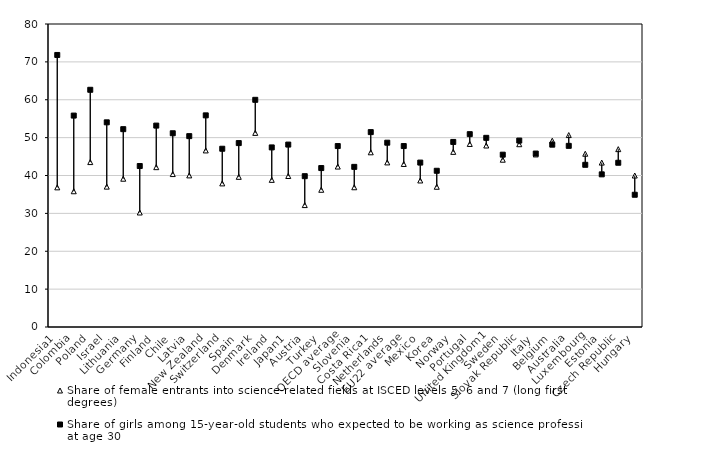
| Category | Share of female entrants into science-related fields at ISCED levels 5, 6 and 7 (long first degrees) | Share of girls among 15-year-old students who expected to be working as science professionals at age 30 |
|---|---|---|
| Indonesia1 | 36.871 | 71.824 |
| Colombia | 35.838 | 55.819 |
| Poland | 43.543 | 62.632 |
| Israel | 37.062 | 54.038 |
| Lithuania | 39.146 | 52.234 |
| Germany | 30.234 | 42.501 |
| Finland | 42.201 | 53.173 |
| Chile | 40.375 | 51.154 |
| Latvia | 40.027 | 50.394 |
| New Zealand | 46.619 | 55.876 |
| Switzerland | 37.915 | 47.063 |
| Spain | 39.647 | 48.558 |
| Denmark | 51.25 | 59.983 |
| Ireland | 38.846 | 47.415 |
| Japan1 | 39.867 | 48.164 |
| Austria | 32.19 | 39.819 |
| Turkey | 36.226 | 41.967 |
| OECD average | 42.363 | 47.774 |
| Slovenia | 36.896 | 42.278 |
| Costa Rica1 | 46.124 | 51.454 |
| Netherlands | 43.453 | 48.659 |
| EU22 average | 43.044 | 47.774 |
| Mexico | 38.686 | 43.408 |
| Korea | 37.025 | 41.247 |
| Norway | 46.242 | 48.86 |
| Portugal | 48.328 | 50.916 |
| United Kingdom1 | 47.919 | 49.942 |
| Sweden | 44.168 | 45.498 |
| Slovak Republic | 48.261 | 49.22 |
| Italy | 45.559 | 45.796 |
| Belgium | 49.189 | 48.143 |
| Australia | 50.675 | 47.827 |
| Luxembourg | 45.745 | 42.823 |
| Estonia | 43.411 | 40.303 |
| Czech Republic | 46.959 | 43.365 |
| Hungary | 39.993 | 34.915 |